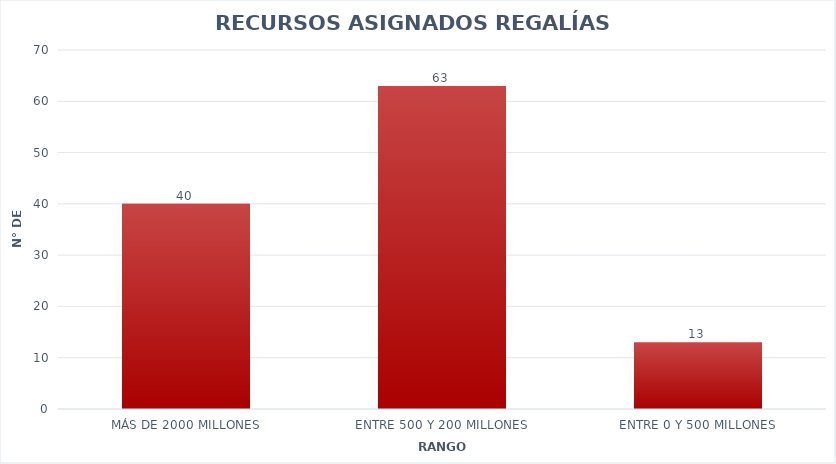
| Category | Series 0 |
|---|---|
| MÁS DE 2000 MILLONES | 40 |
| ENTRE 500 Y 200 MILLONES | 63 |
| ENTRE 0 Y 500 MILLONES | 13 |